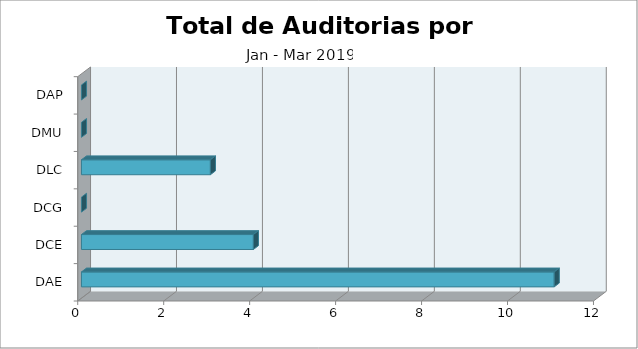
| Category | TOTAL |
|---|---|
| DAE | 11 |
| DCE | 4 |
| DCG | 0 |
| DLC | 3 |
| DMU | 0 |
| DAP | 0 |